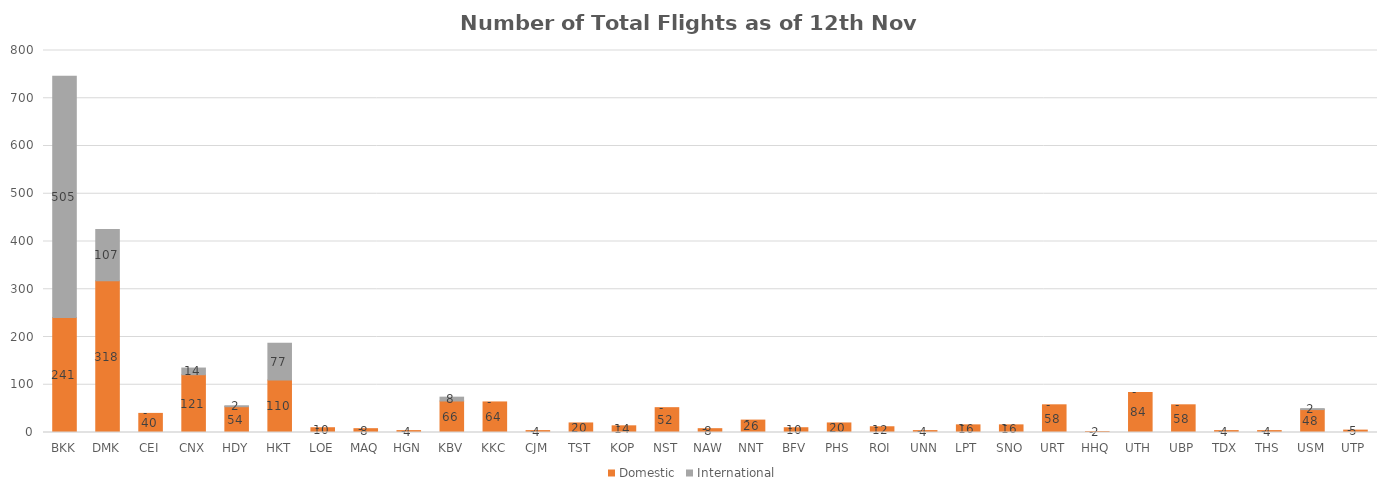
| Category | Domestic | International |
|---|---|---|
| BKK | 241 | 505 |
| DMK | 318 | 107 |
| CEI | 40 | 0 |
| CNX | 121 | 14 |
| HDY | 54 | 2 |
| HKT | 110 | 77 |
| LOE | 10 | 0 |
| MAQ | 8 | 0 |
| HGN | 4 | 0 |
| KBV | 66 | 8 |
| KKC | 64 | 0 |
| CJM | 4 | 0 |
| TST | 20 | 0 |
| KOP | 14 | 0 |
| NST | 52 | 0 |
| NAW | 8 | 0 |
| NNT | 26 | 0 |
| BFV | 10 | 0 |
| PHS | 20 | 0 |
| ROI | 12 | 0 |
| UNN | 4 | 0 |
| LPT | 16 | 0 |
| SNO | 16 | 0 |
| URT | 58 | 0 |
| HHQ | 2 | 0 |
| UTH | 84 | 0 |
| UBP | 58 | 0 |
| TDX | 4 | 0 |
| THS | 4 | 0 |
| USM | 48 | 2 |
| UTP | 5 | 0 |